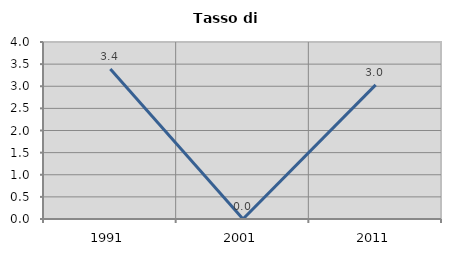
| Category | Tasso di disoccupazione   |
|---|---|
| 1991.0 | 3.39 |
| 2001.0 | 0 |
| 2011.0 | 3.03 |